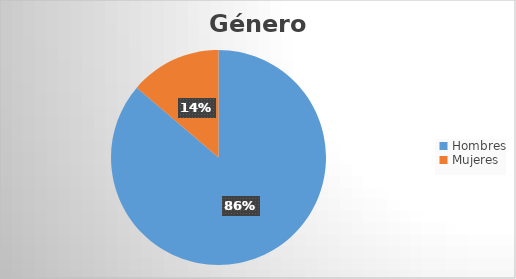
| Category | Series 0 |
|---|---|
| Hombres | 295 |
| Mujeres | 47 |